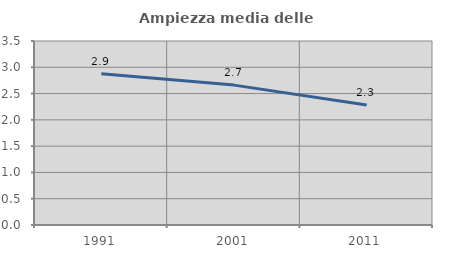
| Category | Ampiezza media delle famiglie |
|---|---|
| 1991.0 | 2.879 |
| 2001.0 | 2.661 |
| 2011.0 | 2.283 |